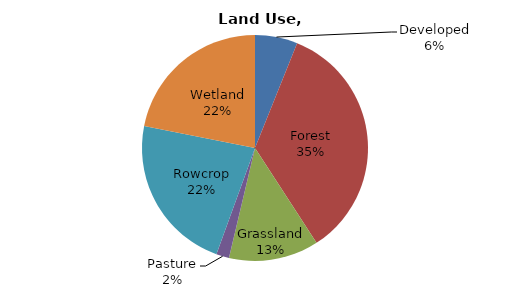
| Category | Series 0 |
|---|---|
| Developed | 131.679 |
| Forest | 752.719 |
| Grassland | 278.584 |
| Pasture | 39.935 |
| Rowcrop | 488.501 |
| Wetland | 474.051 |